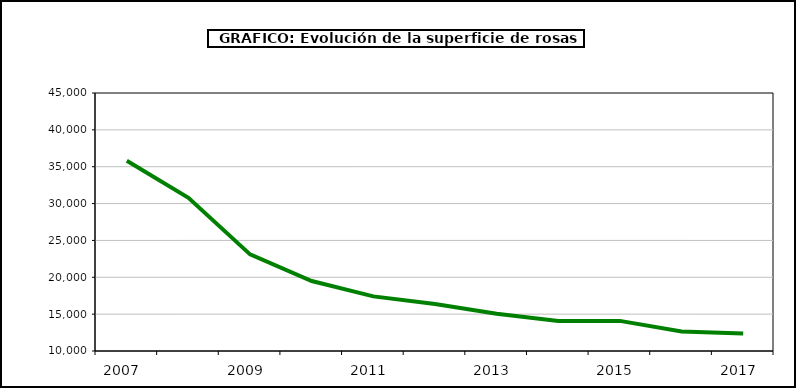
| Category | superficie |
|---|---|
| 2007.0 | 35800 |
| 2008.0 | 30773 |
| 2009.0 | 23105 |
| 2010.0 | 19496 |
| 2011.0 | 17410 |
| 2012.0 | 16373 |
| 2013.0 | 15043 |
| 2014.0 | 14063 |
| 2015.0 | 14086 |
| 2016.0 | 12651 |
| 2017.0 | 12371 |